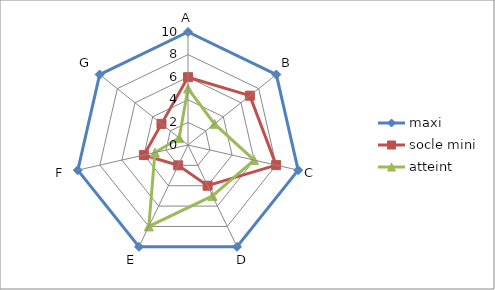
| Category | maxi | socle mini | atteint |
|---|---|---|---|
| A | 10 | 6 | 5 |
| B | 10 | 7 | 3 |
| C | 10 | 8 | 6 |
| D | 10 | 4 | 5 |
| E | 10 | 2 | 8 |
| F  | 10 | 4 | 3 |
| G | 10 | 3 | 1 |